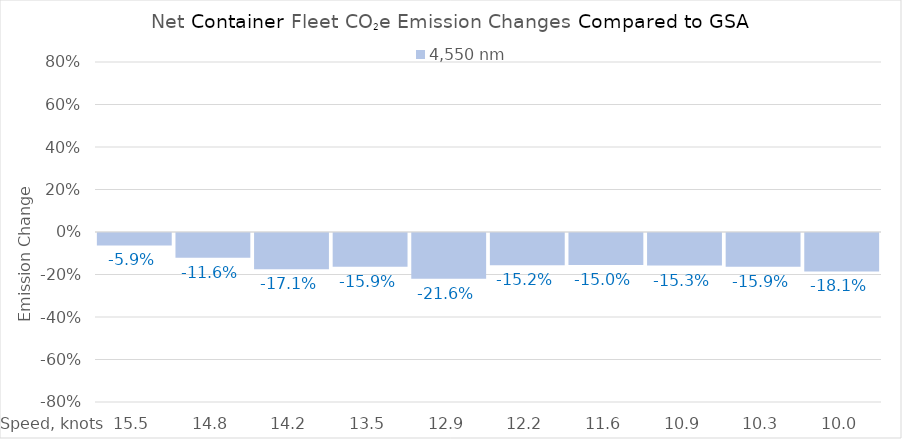
| Category | 4,550 |
|---|---|
| 15.450000000000001 | -0.059 |
| 14.8 | -0.116 |
| 14.15 | -0.171 |
| 13.5 | -0.159 |
| 12.85 | -0.216 |
| 12.2 | -0.152 |
| 11.549999999999999 | -0.15 |
| 10.899999999999999 | -0.153 |
| 10.249999999999998 | -0.159 |
| 10.0 | -0.181 |